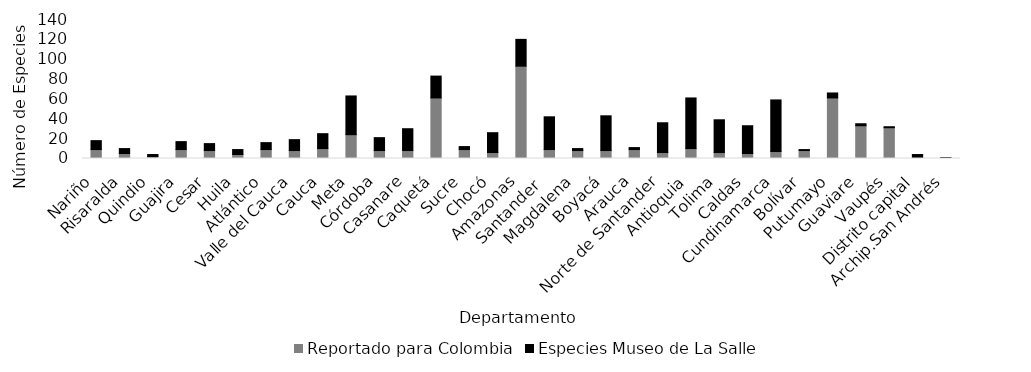
| Category | Reportado para Colombia | Especies Museo de La Salle |
|---|---|---|
| Nariño | 9 | 9 |
| Risaralda | 5 | 5 |
| Quindio | 2 | 2 |
| Guajira | 9 | 8 |
| Cesar | 8 | 7 |
| Huila | 4 | 5 |
| Atlántico | 9 | 7 |
| Valle del Cauca | 8 | 11 |
| Cauca | 10 | 15 |
| Meta | 24 | 39 |
| Córdoba | 8 | 13 |
| Casanare | 8 | 22 |
| Caquetá | 61 | 22 |
| Sucre | 9 | 3 |
| Chocó | 6 | 20 |
| Amazonas | 93 | 27 |
| Santander  | 9 | 33 |
| Magdalena | 8 | 2 |
| Boyacá | 8 | 35 |
| Arauca | 9 | 2 |
| Norte de Santander | 6 | 30 |
| Antioquia | 10 | 51 |
| Tolima | 6 | 33 |
| Caldas | 5 | 28 |
| Cundinamarca | 7 | 52 |
| Bolívar | 8 | 1 |
| Putumayo | 61 | 5 |
| Guaviare | 33 | 2 |
| Vaupés | 31 | 1 |
| Distrito capital | 0 | 4 |
| Archip.San Andrés | 0 | 1 |